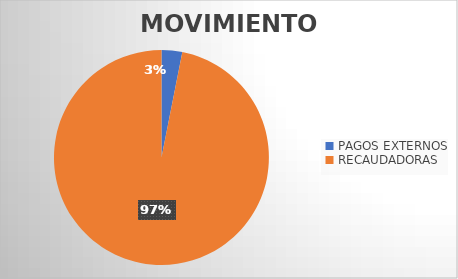
| Category | MOVIMIENTOS |
|---|---|
| PAGOS EXTERNOS | 571 |
| RECAUDADORAS | 17789 |